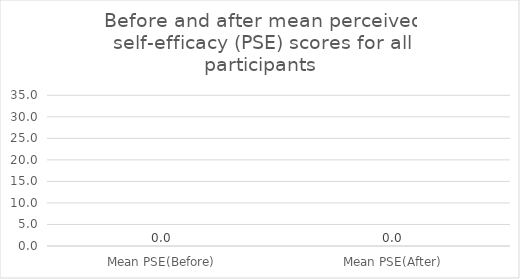
| Category | Series 0 |
|---|---|
| Mean PSE(Before) | 0 |
| Mean PSE(After) | 0 |